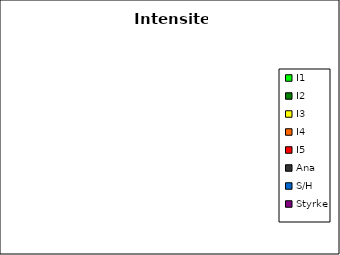
| Category | Intensitet |
|---|---|
| I1 | 0 |
| I2 | 0 |
| I3 | 0 |
| I4 | 0 |
| I5 | 0 |
| Ana | 0 |
| S/H | 0 |
| Styrke | 0 |